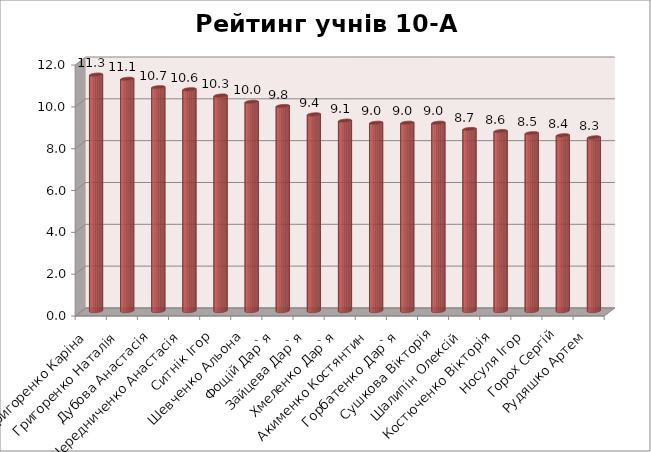
| Category | Series 0 |
|---|---|
|  Григоренко Каріна | 11.3 |
|  Григоренко Наталія | 11.1 |
| Дубова Анастасія | 10.7 |
| Чередниченко Анастасія | 10.6 |
| Ситнік Ігор | 10.3 |
| Шевченко Альона | 10 |
| Фощій Дар`я | 9.8 |
| Зайцева Дар`я | 9.4 |
| Хмеленко Дар`я | 9.1 |
|  Акименко Костянтин | 9 |
|  Горбатенко Дар`я | 9 |
| Сушкова Вікторія | 9 |
| Шалипін Олексій | 8.7 |
| Костюченко Вікторія | 8.6 |
|  Носуля Ігор | 8.5 |
| Горох Сергій | 8.4 |
| Рудяшко Артем | 8.3 |